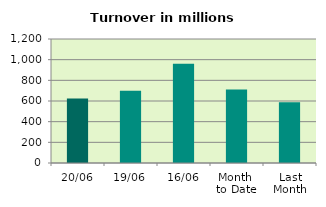
| Category | Series 0 |
|---|---|
| 20/06 | 623.867 |
| 19/06 | 698.003 |
| 16/06 | 960.078 |
| Month 
to Date | 711.797 |
| Last
Month | 587.249 |